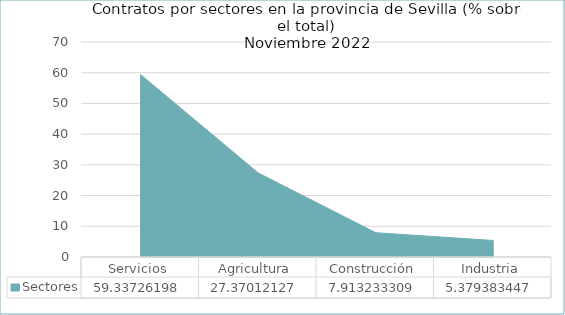
| Category | Sectores |
|---|---|
| Servicios | 59.337 |
| Agricultura | 27.37 |
| Construcción | 7.913 |
| Industria | 5.379 |